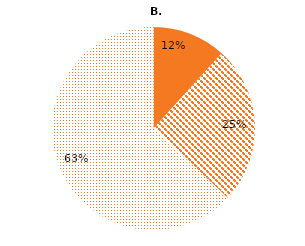
| Category | Series 0 |
|---|---|
| Unprocessed | 39400000 |
| Semi-processed | 84900000 |
| Fully-processed | 212000000 |